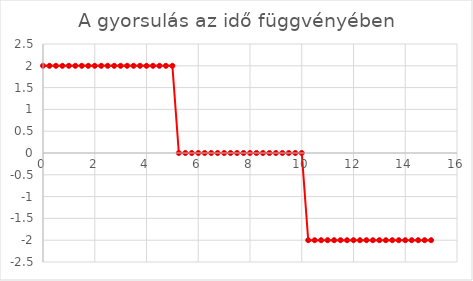
| Category | Series 0 |
|---|---|
| 0.0 | 2 |
| 0.25 | 2 |
| 0.5 | 2 |
| 0.75 | 2 |
| 1.0 | 2 |
| 1.25 | 2 |
| 1.5 | 2 |
| 1.75 | 2 |
| 2.0 | 2 |
| 2.25 | 2 |
| 2.5 | 2 |
| 2.75 | 2 |
| 3.0 | 2 |
| 3.25 | 2 |
| 3.5 | 2 |
| 3.75 | 2 |
| 4.0 | 2 |
| 4.25 | 2 |
| 4.5 | 2 |
| 4.75 | 2 |
| 5.0 | 2 |
| 5.25 | 0 |
| 5.5 | 0 |
| 5.75 | 0 |
| 6.0 | 0 |
| 6.25 | 0 |
| 6.5 | 0 |
| 6.75 | 0 |
| 7.0 | 0 |
| 7.25 | 0 |
| 7.5 | 0 |
| 7.75 | 0 |
| 8.0 | 0 |
| 8.25 | 0 |
| 8.5 | 0 |
| 8.75 | 0 |
| 9.0 | 0 |
| 9.25 | 0 |
| 9.5 | 0 |
| 9.75 | 0 |
| 10.0 | 0 |
| 10.25 | -2 |
| 10.5 | -2 |
| 10.75 | -2 |
| 11.0 | -2 |
| 11.25 | -2 |
| 11.5 | -2 |
| 11.75 | -2 |
| 12.0 | -2 |
| 12.25 | -2 |
| 12.5 | -2 |
| 12.75 | -2 |
| 13.0 | -2 |
| 13.25 | -2 |
| 13.5 | -2 |
| 13.75 | -2 |
| 14.0 | -2 |
| 14.25 | -2 |
| 14.5 | -2 |
| 14.75 | -2 |
| 15.0 | -2 |